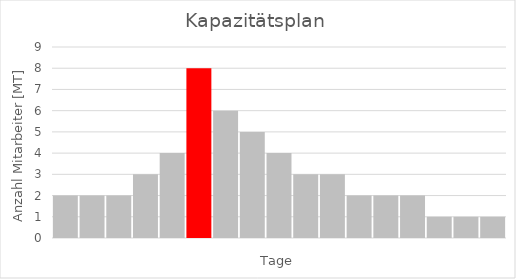
| Category | Series 0 |
|---|---|
| 0 | 2 |
| 1 | 2 |
| 2 | 2 |
| 3 | 3 |
| 4 | 4 |
| 5 | 8 |
| 6 | 6 |
| 7 | 5 |
| 8 | 4 |
| 9 | 3 |
| 10 | 3 |
| 11 | 2 |
| 12 | 2 |
| 13 | 2 |
| 14 | 1 |
| 15 | 1 |
| 16 | 1 |